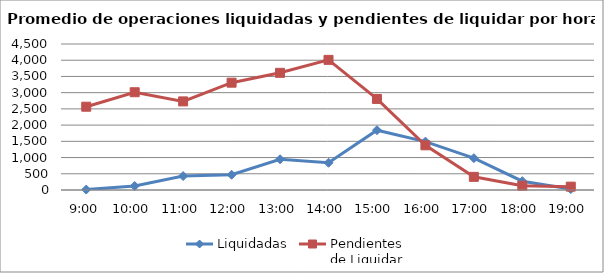
| Category | Liquidadas | Pendientes
de Liquidar |
|---|---|---|
| 0.375 | 14.143 | 2567.238 |
| 0.4166666666666667 | 121.714 | 3013.429 |
| 0.4583333333333333 | 428.619 | 2730.762 |
| 0.5 | 469.857 | 3307.81 |
| 0.5416666666666666 | 946.524 | 3611.619 |
| 0.583333333333333 | 839.81 | 4010.952 |
| 0.625 | 1842.952 | 2807.048 |
| 0.666666666666667 | 1490.333 | 1376.952 |
| 0.708333333333333 | 981.619 | 405.429 |
| 0.75 | 271.81 | 131.905 |
| 0.791666666666667 | 28.429 | 103.524 |